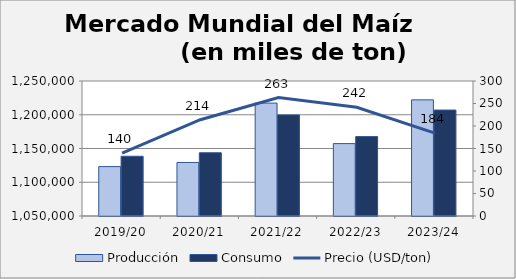
| Category | Producción | Consumo |
|---|---|---|
| 2019/20 | 1123184 | 1138514 |
| 2020/21 | 1129313 | 1143721 |
| 2021/22 | 1217268 | 1199700 |
| 2022/23 | 1157243 | 1167656 |
| 2023/24 | 1222070 | 1206955 |